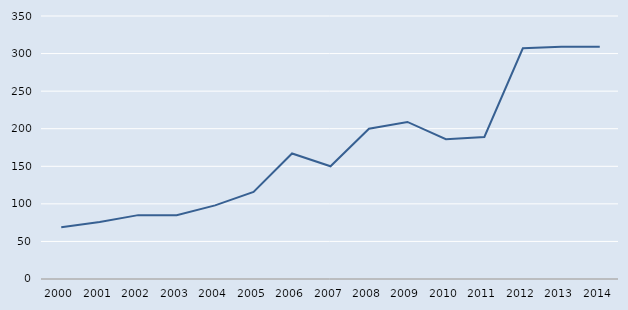
| Category | Series 0 |
|---|---|
| 2000.0 | 69 |
| 2001.0 | 76 |
| 2002.0 | 85 |
| 2003.0 | 85 |
| 2004.0 | 98 |
| 2005.0 | 116 |
| 2006.0 | 167 |
| 2007.0 | 150 |
| 2008.0 | 200 |
| 2009.0 | 209 |
| 2010.0 | 186 |
| 2011.0 | 189 |
| 2012.0 | 307 |
| 2013.0 | 309 |
| 2014.0 | 309 |